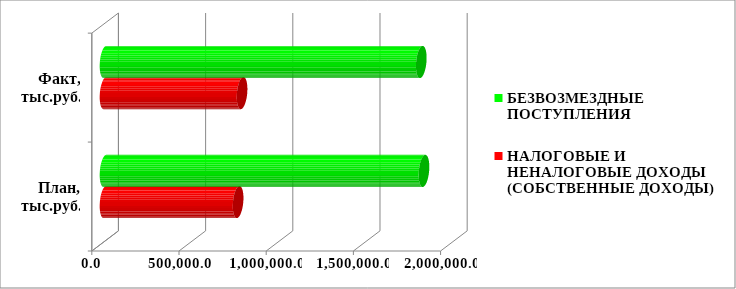
| Category | НАЛОГОВЫЕ И НЕНАЛОГОВЫЕ ДОХОДЫ (СОБСТВЕННЫЕ ДОХОДЫ) | БЕЗВОЗМЕЗДНЫЕ ПОСТУПЛЕНИЯ |
|---|---|---|
| План, тыс.руб. | 763375.5 | 1829201.5 |
| Факт, тыс.руб. | 786049.2 | 1813766.1 |